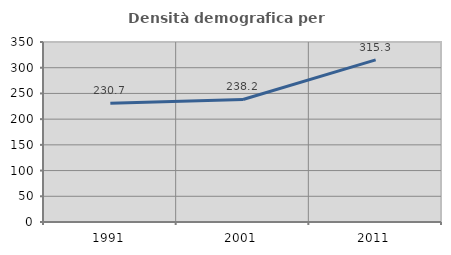
| Category | Densità demografica |
|---|---|
| 1991.0 | 230.697 |
| 2001.0 | 238.214 |
| 2011.0 | 315.316 |